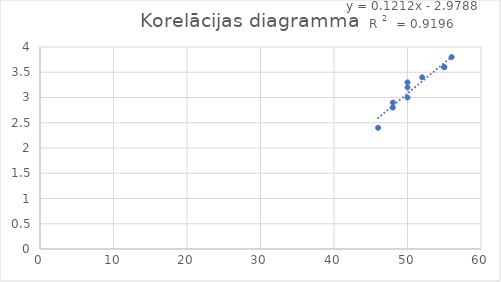
| Category | Series 0 |
|---|---|
| 46.0 | 2.4 |
| 48.0 | 2.8 |
| 48.0 | 2.9 |
| 50.0 | 3 |
| 50.0 | 3.2 |
| 50.0 | 3.3 |
| 52.0 | 3.4 |
| 55.0 | 3.6 |
| 55.0 | 3.6 |
| 56.0 | 3.8 |